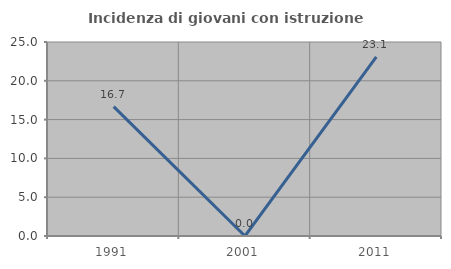
| Category | Incidenza di giovani con istruzione universitaria |
|---|---|
| 1991.0 | 16.667 |
| 2001.0 | 0 |
| 2011.0 | 23.077 |